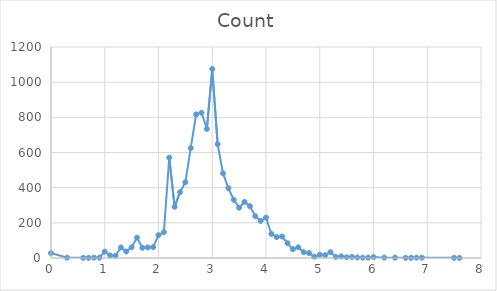
| Category | Count of Log FileSizes |
|---|---|
| 0.0 | 28 |
| 0.3 | 2 |
| 0.6 | 1 |
| 0.7 | 1 |
| 0.8 | 2 |
| 0.9 | 2 |
| 1.0 | 36 |
| 1.1 | 15 |
| 1.2 | 13 |
| 1.3 | 60 |
| 1.4 | 37 |
| 1.5 | 61 |
| 1.6 | 116 |
| 1.7 | 58 |
| 1.8 | 60 |
| 1.9 | 62 |
| 2.0 | 130 |
| 2.1 | 147 |
| 2.2 | 571 |
| 2.3 | 291 |
| 2.4 | 374 |
| 2.5 | 431 |
| 2.6 | 625 |
| 2.7 | 817 |
| 2.8 | 826 |
| 2.9 | 734 |
| 3.0 | 1075 |
| 3.1 | 647 |
| 3.2 | 482 |
| 3.3 | 397 |
| 3.4 | 331 |
| 3.5 | 286 |
| 3.6 | 319 |
| 3.7 | 295 |
| 3.8 | 238 |
| 3.9 | 211 |
| 4.0 | 230 |
| 4.1 | 137 |
| 4.2 | 119 |
| 4.3 | 122 |
| 4.4 | 84 |
| 4.5 | 50 |
| 4.6 | 61 |
| 4.7 | 33 |
| 4.8 | 28 |
| 4.9 | 7 |
| 5.0 | 19 |
| 5.1 | 16 |
| 5.2 | 33 |
| 5.3 | 6 |
| 5.4 | 9 |
| 5.5 | 4 |
| 5.6 | 6 |
| 5.7 | 3 |
| 5.8 | 2 |
| 5.9 | 2 |
| 6.0 | 5 |
| 6.2 | 2 |
| 6.4 | 2 |
| 6.6 | 1 |
| 6.7 | 1 |
| 6.8 | 2 |
| 6.9 | 2 |
| 7.5 | 1 |
| 7.6 | 1 |